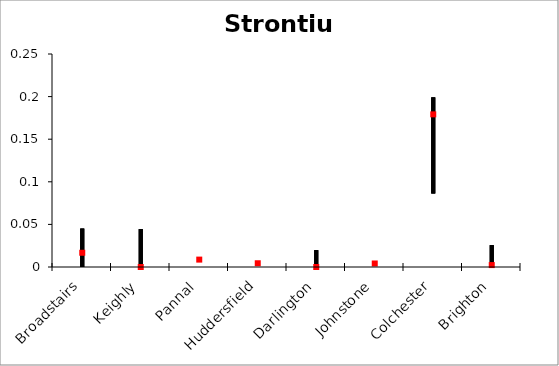
| Category | Strontium | Series 1 | Series 2 |
|---|---|---|---|
| Broadstairs | 0.045 | 0 | 0.017 |
| Keighly | 0.044 | 0 | 0 |
| Pannal | 0.009 | 0.008 | 0.009 |
| Huddersfield | 0.005 | 0.002 | 0.004 |
| Darlington | 0.02 | 0 | 0 |
| Johnstone | 0.005 | 0.004 | 0.004 |
| Colchester | 0.199 | 0.086 | 0.179 |
| Brighton | 0.026 | 0 | 0.002 |